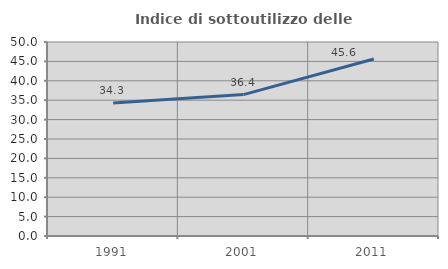
| Category | Indice di sottoutilizzo delle abitazioni  |
|---|---|
| 1991.0 | 34.271 |
| 2001.0 | 36.447 |
| 2011.0 | 45.608 |